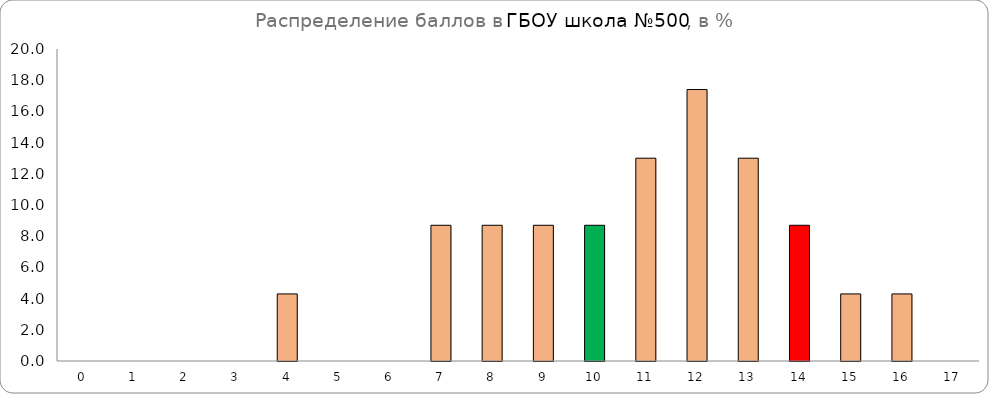
| Category | Series 0 |
|---|---|
| 0.0 | 0 |
| 1.0 | 0 |
| 2.0 | 0 |
| 3.0 | 0 |
| 4.0 | 4.3 |
| 5.0 | 0 |
| 6.0 | 0 |
| 7.0 | 8.7 |
| 8.0 | 8.7 |
| 9.0 | 8.7 |
| 10.0 | 8.7 |
| 11.0 | 13 |
| 12.0 | 17.4 |
| 13.0 | 13 |
| 14.0 | 8.7 |
| 15.0 | 4.3 |
| 16.0 | 4.3 |
| 17.0 | 0 |